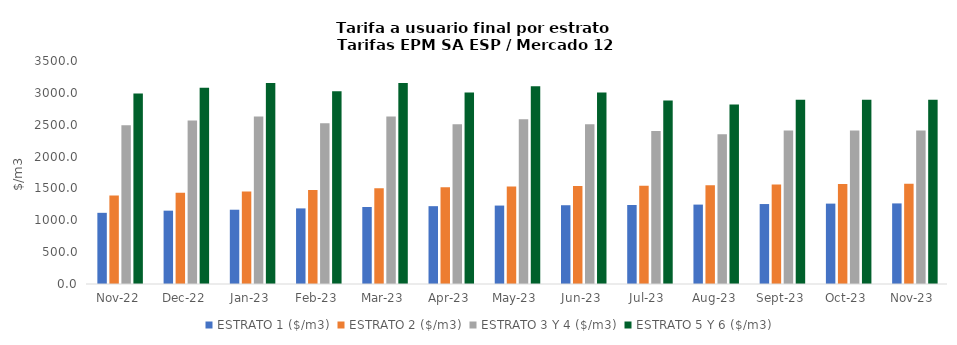
| Category | ESTRATO 1 ($/m3) | ESTRATO 2 ($/m3) | ESTRATO 3 Y 4 ($/m3) | ESTRATO 5 Y 6 ($/m3) |
|---|---|---|---|---|
| 2022-11-01 | 1117.11 | 1389.55 | 2493.09 | 2991.708 |
| 2022-12-01 | 1151.14 | 1432.98 | 2567.54 | 3081.048 |
| 2023-01-01 | 1165.79 | 1451.1 | 2629.41 | 3155.292 |
| 2023-02-01 | 1186.59 | 1476.94 | 2522.44 | 3026.928 |
| 2023-03-01 | 1208.96 | 1503.32 | 2629.41 | 3155.292 |
| 2023-04-01 | 1221.6 | 1518.97 | 2505.94 | 3007.128 |
| 2023-05-01 | 1231.01 | 1530.94 | 2586.17 | 3103.404 |
| 2023-06-01 | 1236.39 | 1537.58 | 2505.94 | 3007.128 |
| 2023-07-01 | 1240.07 | 1542.24 | 2401.05 | 2881.26 |
| 2023-08-01 | 1246.26 | 1549.97 | 2349.35 | 2819.22 |
| 2023-09-01 | 1254.93 | 1560.74 | 2408.97 | 2890.764 |
| 2023-10-01 | 1261.68 | 1568.93 | 2408.97 | 2890.764 |
| 2023-11-01 | 1264.8 | 1572.96 | 2408.97 | 2890.764 |